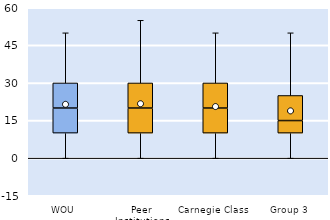
| Category | 25th | 50th | 75th |
|---|---|---|---|
| WOU | 10 | 10 | 10 |
| Peer Institutions | 10 | 10 | 10 |
| Carnegie Class | 10 | 10 | 10 |
| Group 3 | 10 | 5 | 10 |